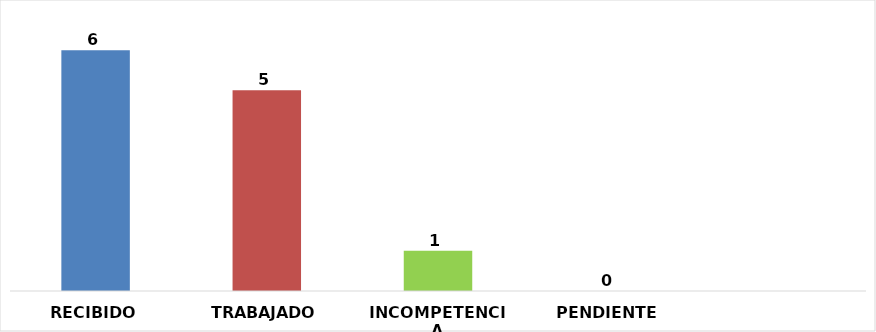
| Category | RECIBIDO |
|---|---|
| RECIBIDO | 6 |
| TRABAJADO | 5 |
| INCOMPETENCIA | 1 |
| PENDIENTE | 0 |